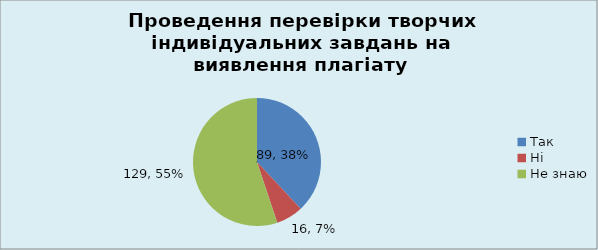
| Category | Кількість | % |
|---|---|---|
| Так | 89 | 0.38 |
| Ні | 16 | 0.068 |
| Не знаю | 129 | 0.551 |